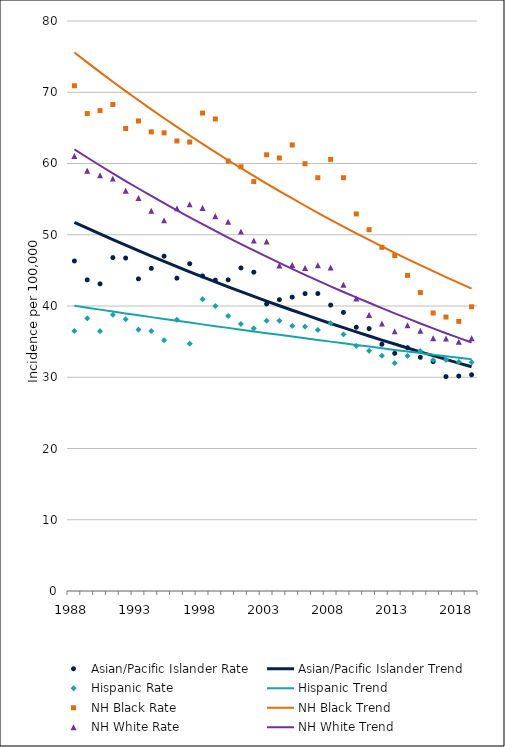
| Category | Asian/Pacific Islander Rate | Asian/Pacific Islander Trend | Hispanic Rate | Hispanic Trend | NH Black Rate | NH Black Trend | NH White Rate | NH White Trend |
|---|---|---|---|---|---|---|---|---|
| 1988.0 | 46.32 | 51.75 | 36.48 | 40.02 | 70.91 | 75.58 | 61.05 | 61.98 |
| 1989.0 | 43.67 | 50.93 | 38.27 | 39.75 | 67.01 | 74.19 | 59 | 60.84 |
| 1990.0 | 43.11 | 50.12 | 36.48 | 39.49 | 67.42 | 72.82 | 58.34 | 59.72 |
| 1991.0 | 46.79 | 49.32 | 38.78 | 39.22 | 68.29 | 71.48 | 57.88 | 58.62 |
| 1992.0 | 46.73 | 48.54 | 38.15 | 38.96 | 64.91 | 70.16 | 56.19 | 57.54 |
| 1993.0 | 43.81 | 47.77 | 36.68 | 38.7 | 65.97 | 68.87 | 55.15 | 56.49 |
| 1994.0 | 45.28 | 47.01 | 36.49 | 38.44 | 64.44 | 67.6 | 53.36 | 55.45 |
| 1995.0 | 46.99 | 46.26 | 35.18 | 38.19 | 64.3 | 66.35 | 52.02 | 54.43 |
| 1996.0 | 43.91 | 45.52 | 38.08 | 37.93 | 63.16 | 65.13 | 53.71 | 53.43 |
| 1997.0 | 45.93 | 44.8 | 34.71 | 37.68 | 63.01 | 63.93 | 54.27 | 52.45 |
| 1998.0 | 44.22 | 44.09 | 40.95 | 37.42 | 67.08 | 62.75 | 53.77 | 51.48 |
| 1999.0 | 43.63 | 43.38 | 39.99 | 37.17 | 66.25 | 61.59 | 52.61 | 50.53 |
| 2000.0 | 43.67 | 42.69 | 38.59 | 36.93 | 60.35 | 60.46 | 51.82 | 49.61 |
| 2001.0 | 45.34 | 42.01 | 37.47 | 36.68 | 59.54 | 59.34 | 50.44 | 48.69 |
| 2002.0 | 44.75 | 41.35 | 36.87 | 36.43 | 57.46 | 58.25 | 49.18 | 47.8 |
| 2003.0 | 40.29 | 40.69 | 37.94 | 36.19 | 61.22 | 57.18 | 49.05 | 46.92 |
| 2004.0 | 40.89 | 40.04 | 37.92 | 35.95 | 60.77 | 56.12 | 45.69 | 46.06 |
| 2005.0 | 41.25 | 39.4 | 37.21 | 35.71 | 62.6 | 55.09 | 45.77 | 45.21 |
| 2006.0 | 41.74 | 38.78 | 37.1 | 35.47 | 59.97 | 54.07 | 45.35 | 44.38 |
| 2007.0 | 41.75 | 38.16 | 36.62 | 35.23 | 58 | 53.07 | 45.71 | 43.56 |
| 2008.0 | 40.13 | 37.55 | 37.58 | 35 | 60.58 | 52.1 | 45.4 | 42.76 |
| 2009.0 | 39.1 | 36.96 | 36.03 | 34.76 | 58 | 51.14 | 43 | 41.97 |
| 2010.0 | 37.02 | 36.37 | 34.4 | 34.53 | 52.92 | 50.19 | 41.07 | 41.2 |
| 2011.0 | 36.83 | 35.79 | 33.73 | 34.3 | 50.71 | 49.27 | 38.75 | 40.45 |
| 2012.0 | 34.63 | 35.22 | 33.01 | 34.07 | 48.24 | 48.36 | 37.53 | 39.7 |
| 2013.0 | 33.36 | 34.66 | 31.99 | 33.84 | 47.08 | 47.47 | 36.44 | 38.97 |
| 2014.0 | 34.14 | 34.11 | 32.99 | 33.62 | 44.3 | 46.59 | 37.3 | 38.26 |
| 2015.0 | 32.8 | 33.57 | 33.67 | 33.39 | 41.88 | 45.73 | 36.52 | 37.55 |
| 2016.0 | 32.19 | 33.03 | 32.41 | 33.17 | 39.02 | 44.89 | 35.49 | 36.86 |
| 2017.0 | 30.09 | 32.51 | 32.43 | 32.95 | 38.45 | 44.06 | 35.44 | 36.18 |
| 2018.0 | 30.17 | 31.99 | 32.15 | 32.73 | 37.84 | 43.25 | 34.98 | 35.52 |
| 2019.0 | 30.35 | 31.48 | 32.11 | 32.51 | 39.89 | 42.45 | 35.48 | 34.87 |